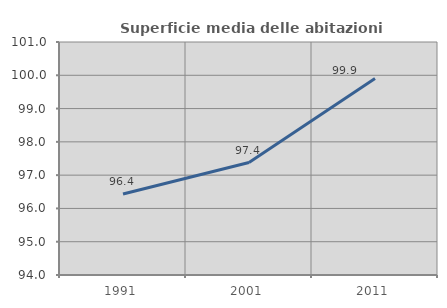
| Category | Superficie media delle abitazioni occupate |
|---|---|
| 1991.0 | 96.433 |
| 2001.0 | 97.379 |
| 2011.0 | 99.904 |